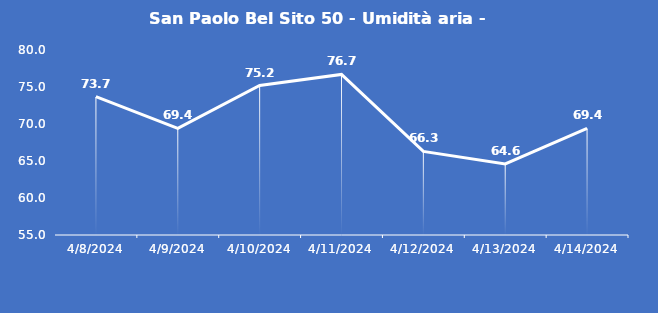
| Category | San Paolo Bel Sito 50 - Umidità aria - Grezzo (%) |
|---|---|
| 4/8/24 | 73.7 |
| 4/9/24 | 69.4 |
| 4/10/24 | 75.2 |
| 4/11/24 | 76.7 |
| 4/12/24 | 66.3 |
| 4/13/24 | 64.6 |
| 4/14/24 | 69.4 |